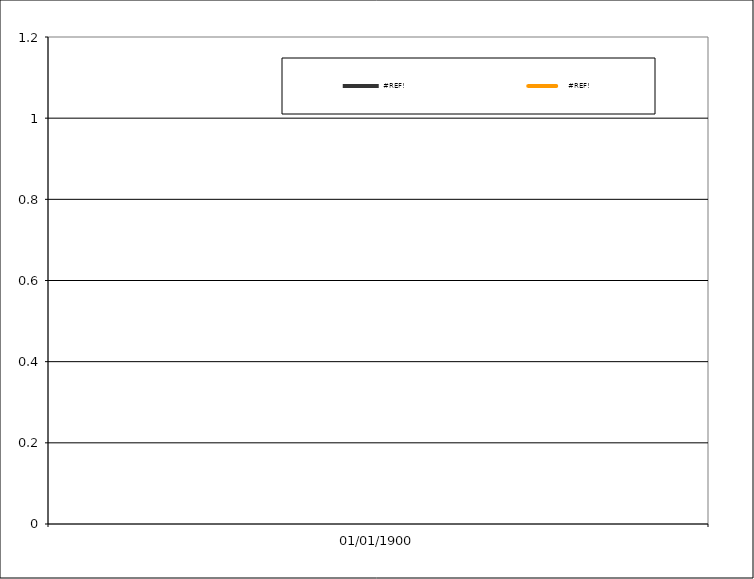
| Category | #REF! |
|---|---|
| 01/01/1900 | 1 |